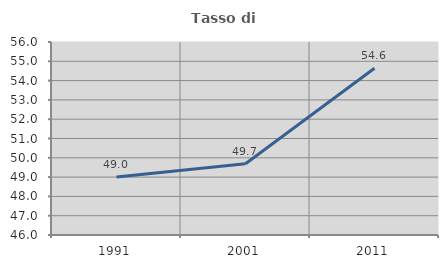
| Category | Tasso di occupazione   |
|---|---|
| 1991.0 | 49.011 |
| 2001.0 | 49.693 |
| 2011.0 | 54.637 |